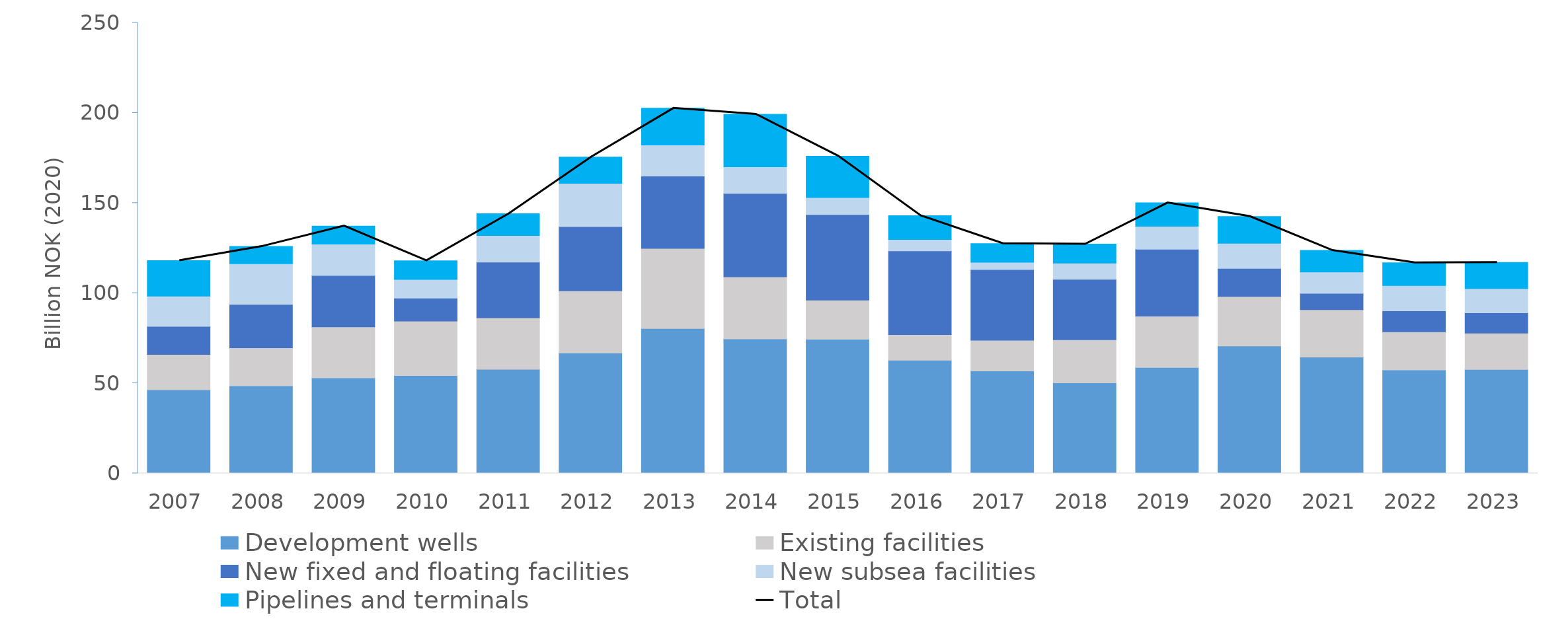
| Category | Development wells | Existing facilities | New fixed and floating facilities | New subsea facilities | Pipelines and terminals |
|---|---|---|---|---|---|
| 2007.0 | 46.398 | 19.583 | 15.615 | 16.735 | 19.672 |
| 2008.0 | 48.59 | 21.019 | 24.105 | 22.617 | 9.549 |
| 2009.0 | 52.945 | 28.352 | 28.472 | 17.411 | 10.042 |
| 2010.0 | 54.262 | 30.223 | 12.788 | 10.326 | 10.375 |
| 2011.0 | 57.708 | 28.588 | 30.885 | 14.74 | 12.163 |
| 2012.0 | 66.812 | 34.475 | 35.598 | 24.008 | 14.599 |
| 2013.0 | 80.386 | 44.411 | 40.179 | 17.17 | 20.438 |
| 2014.0 | 74.603 | 34.486 | 46.244 | 14.749 | 29.147 |
| 2015.0 | 74.422 | 21.684 | 47.497 | 9.457 | 22.932 |
| 2016.0 | 62.766 | 14.248 | 46.411 | 6.38 | 13.191 |
| 2017.0 | 56.786 | 17.079 | 39.243 | 4.038 | 10.346 |
| 2018.0 | 50.188 | 23.936 | 33.528 | 9.016 | 10.512 |
| 2019.0 | 58.778 | 28.508 | 37.029 | 12.759 | 13.02 |
| 2020.0 | 70.662 | 27.517 | 15.58 | 13.892 | 14.835 |
| 2021.0 | 64.532 | 26.278 | 9.05 | 11.859 | 11.973 |
| 2022.0 | 57.359 | 21.153 | 11.703 | 14.018 | 12.576 |
| 2023.0 | 57.677 | 20.145 | 11.235 | 13.484 | 14.482 |